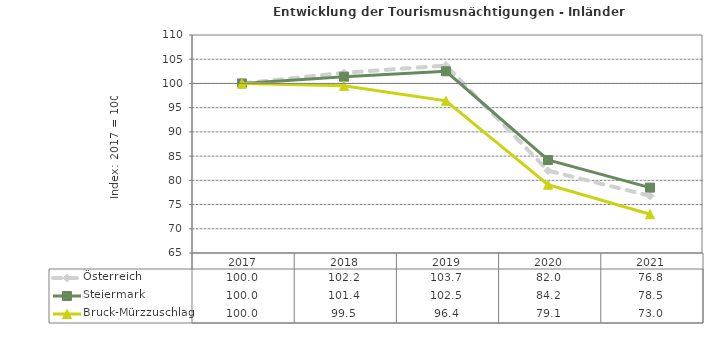
| Category | Österreich | Steiermark | Bruck-Mürzzuschlag |
|---|---|---|---|
| 2021.0 | 76.8 | 78.5 | 73 |
| 2020.0 | 82 | 84.2 | 79.1 |
| 2019.0 | 103.7 | 102.5 | 96.4 |
| 2018.0 | 102.2 | 101.4 | 99.5 |
| 2017.0 | 100 | 100 | 100 |